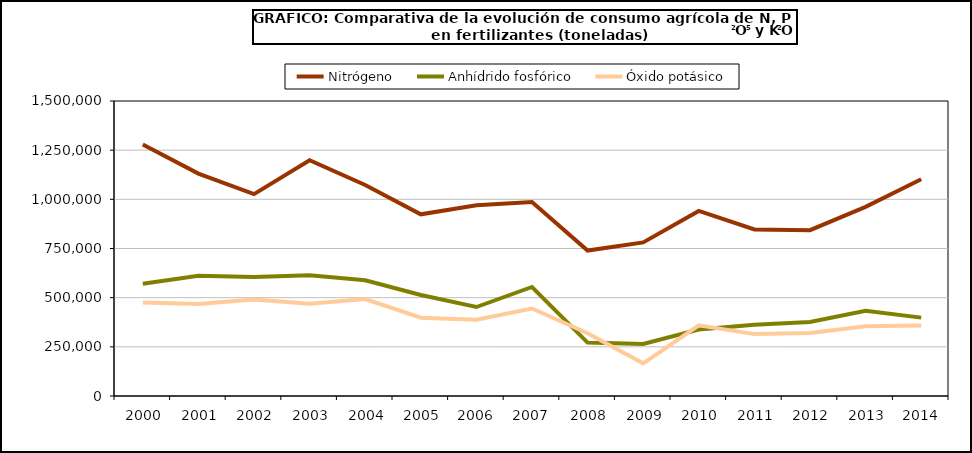
| Category | Nitrógeno | Anhídrido fosfórico | Óxido potásico |
|---|---|---|---|
|   2000 | 1279154 | 570282 | 474822 |
|   2001 | 1131006 | 610838 | 468360 |
|   2002 | 1026546 | 605224 | 491138 |
|   2003 | 1198606 | 614385 | 468511 |
|   2004 | 1072949 | 588820 | 492571 |
|   2005 | 923764 | 513454 | 398230 |
|   2006  | 969783 | 452461 | 388187 |
|   2007  | 985857 | 554382 | 444853 |
|   2008 | 739757 | 271578 | 319194 |
|   2009 | 781069 | 264211 | 166016 |
|   2010 | 940984 | 337812 | 359583 |
|   2011 | 846697 | 362672 | 314642 |
|   2012 | 843410 | 376590 | 320841 |
|   2013 | 961507 | 432904 | 354738 |
|  2014 | 1101895 | 398580 | 357875 |